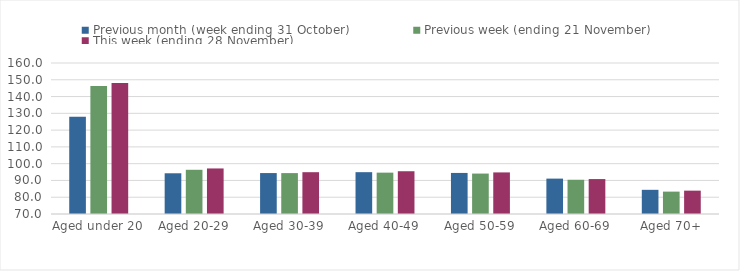
| Category | Previous month (week ending 31 October) | Previous week (ending 21 November) | This week (ending 28 November) |
|---|---|---|---|
| Aged under 20 | 127.93 | 146.26 | 148.03 |
| Aged 20-29 | 94.27 | 96.35 | 97.15 |
| Aged 30-39 | 94.4 | 94.38 | 94.92 |
| Aged 40-49 | 94.93 | 94.65 | 95.49 |
| Aged 50-59 | 94.47 | 94.1 | 94.79 |
| Aged 60-69 | 91.09 | 90.4 | 90.82 |
| Aged 70+ | 84.41 | 83.34 | 83.92 |